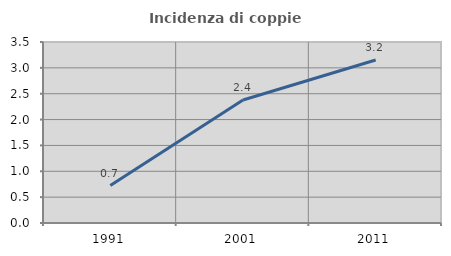
| Category | Incidenza di coppie miste |
|---|---|
| 1991.0 | 0.724 |
| 2001.0 | 2.378 |
| 2011.0 | 3.151 |